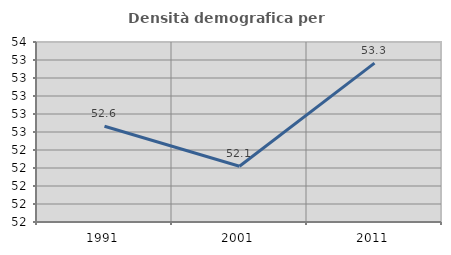
| Category | Densità demografica |
|---|---|
| 1991.0 | 52.563 |
| 2001.0 | 52.12 |
| 2011.0 | 53.266 |